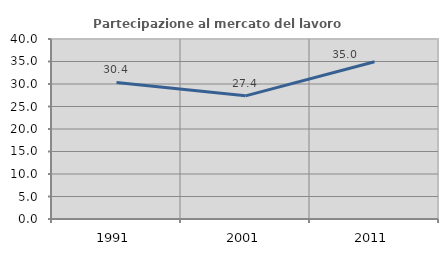
| Category | Partecipazione al mercato del lavoro  femminile |
|---|---|
| 1991.0 | 30.359 |
| 2001.0 | 27.368 |
| 2011.0 | 34.951 |